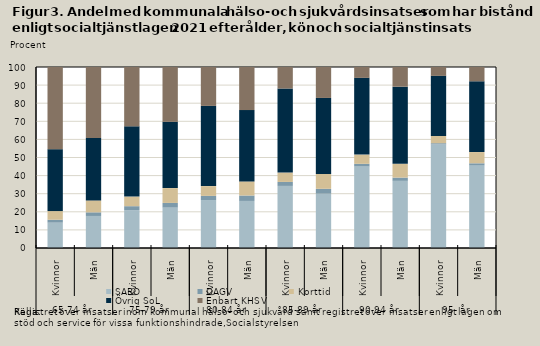
| Category | SÄBO | DAGV | Korttid | Övrig SoL | Enbart KHSV |
|---|---|---|---|---|---|
| 0 | 14 | 1.6 | 4.8 | 34.2 | 45.4 |
| 1 | 17.7 | 2 | 6.6 | 34.5 | 39.2 |
| 2 | 20.9 | 2.2 | 5.3 | 38.8 | 32.8 |
| 3 | 22.3 | 2.6 | 8.2 | 36.6 | 30.3 |
| 4 | 26.5 | 2.3 | 5.4 | 44.3 | 21.5 |
| 5 | 26 | 3 | 7.8 | 39.4 | 23.8 |
| 6 | 34.3 | 2.2 | 5.2 | 46.4 | 11.9 |
| 7 | 30 | 2.7 | 8.2 | 42 | 17.1 |
| 8 | 45.1 | 1.4 | 5.1 | 42.4 | 6 |
| 9 | 37.1 | 1.8 | 7.6 | 42.6 | 10.9 |
| 10 | 57.2 | 0.7 | 4 | 33.2 | 4.9 |
| 11 | 45.8 | 1 | 6.2 | 39.1 | 8 |